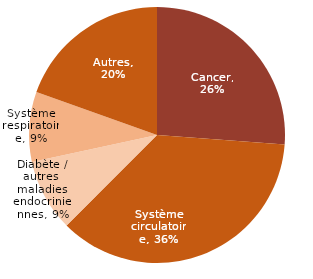
| Category | Series 1 |
|---|---|
| Cancer | 0.262 |
| Système circulatoire | 0.363 |
| Diabète et autres maladies endocriniennes | 0.091 |
| Système respiratoire | 0.088 |
| Autres | 0.196 |